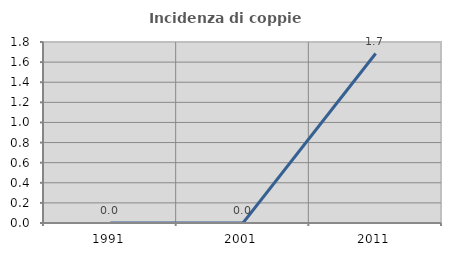
| Category | Incidenza di coppie miste |
|---|---|
| 1991.0 | 0 |
| 2001.0 | 0 |
| 2011.0 | 1.685 |